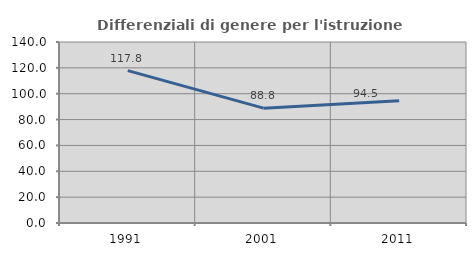
| Category | Differenziali di genere per l'istruzione superiore |
|---|---|
| 1991.0 | 117.848 |
| 2001.0 | 88.82 |
| 2011.0 | 94.538 |